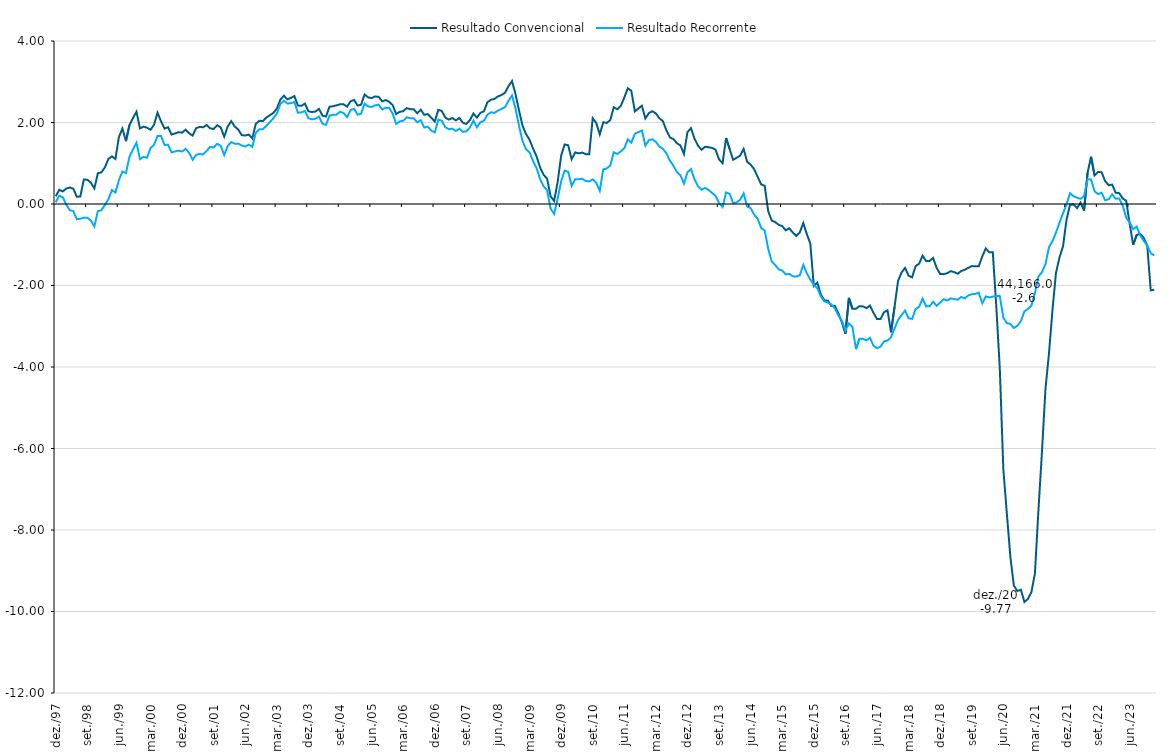
| Category | Resultado Convencional | Resultado Recorrente |
|---|---|---|
| 1997-12-01 | 0.189 | 0.044 |
| 1998-01-01 | 0.349 | 0.204 |
| 1998-02-01 | 0.309 | 0.165 |
| 1998-03-01 | 0.38 | -0.016 |
| 1998-04-01 | 0.404 | -0.152 |
| 1998-05-01 | 0.376 | -0.176 |
| 1998-06-01 | 0.177 | -0.372 |
| 1998-07-01 | 0.184 | -0.362 |
| 1998-08-01 | 0.601 | -0.334 |
| 1998-09-01 | 0.595 | -0.337 |
| 1998-10-01 | 0.525 | -0.407 |
| 1998-11-01 | 0.382 | -0.55 |
| 1998-12-01 | 0.756 | -0.174 |
| 1999-01-01 | 0.776 | -0.153 |
| 1999-02-01 | 0.9 | -0.024 |
| 1999-03-01 | 1.105 | 0.116 |
| 1999-04-01 | 1.168 | 0.341 |
| 1999-05-01 | 1.106 | 0.282 |
| 1999-06-01 | 1.646 | 0.589 |
| 1999-07-01 | 1.85 | 0.797 |
| 1999-08-01 | 1.542 | 0.759 |
| 1999-09-01 | 1.939 | 1.16 |
| 1999-10-01 | 2.109 | 1.337 |
| 1999-11-01 | 2.265 | 1.502 |
| 1999-12-01 | 1.854 | 1.102 |
| 2000-01-01 | 1.9 | 1.156 |
| 2000-02-01 | 1.873 | 1.136 |
| 2000-03-01 | 1.822 | 1.372 |
| 2000-04-01 | 1.944 | 1.453 |
| 2000-05-01 | 2.241 | 1.667 |
| 2000-06-01 | 2.029 | 1.668 |
| 2000-07-01 | 1.85 | 1.45 |
| 2000-08-01 | 1.884 | 1.452 |
| 2000-09-01 | 1.704 | 1.267 |
| 2000-10-01 | 1.732 | 1.289 |
| 2000-11-01 | 1.763 | 1.312 |
| 2000-12-01 | 1.75 | 1.288 |
| 2001-01-01 | 1.824 | 1.352 |
| 2001-02-01 | 1.735 | 1.255 |
| 2001-03-01 | 1.678 | 1.086 |
| 2001-04-01 | 1.862 | 1.206 |
| 2001-05-01 | 1.892 | 1.227 |
| 2001-06-01 | 1.883 | 1.216 |
| 2001-07-01 | 1.937 | 1.303 |
| 2001-08-01 | 1.856 | 1.401 |
| 2001-09-01 | 1.842 | 1.386 |
| 2001-10-01 | 1.933 | 1.478 |
| 2001-11-01 | 1.879 | 1.426 |
| 2001-12-01 | 1.652 | 1.203 |
| 2002-01-01 | 1.902 | 1.422 |
| 2002-02-01 | 2.034 | 1.519 |
| 2002-03-01 | 1.902 | 1.479 |
| 2002-04-01 | 1.826 | 1.482 |
| 2002-05-01 | 1.688 | 1.434 |
| 2002-06-01 | 1.681 | 1.411 |
| 2002-07-01 | 1.704 | 1.457 |
| 2002-08-01 | 1.611 | 1.401 |
| 2002-09-01 | 1.968 | 1.749 |
| 2002-10-01 | 2.043 | 1.831 |
| 2002-11-01 | 2.034 | 1.836 |
| 2002-12-01 | 2.121 | 1.918 |
| 2003-01-01 | 2.178 | 2.01 |
| 2003-02-01 | 2.236 | 2.104 |
| 2003-03-01 | 2.342 | 2.221 |
| 2003-04-01 | 2.563 | 2.455 |
| 2003-05-01 | 2.656 | 2.536 |
| 2003-06-01 | 2.569 | 2.465 |
| 2003-07-01 | 2.604 | 2.473 |
| 2003-08-01 | 2.649 | 2.505 |
| 2003-09-01 | 2.416 | 2.239 |
| 2003-10-01 | 2.411 | 2.249 |
| 2003-11-01 | 2.463 | 2.281 |
| 2003-12-01 | 2.275 | 2.104 |
| 2004-01-01 | 2.257 | 2.078 |
| 2004-02-01 | 2.269 | 2.092 |
| 2004-03-01 | 2.335 | 2.146 |
| 2004-04-01 | 2.168 | 1.971 |
| 2004-05-01 | 2.147 | 1.94 |
| 2004-06-01 | 2.386 | 2.169 |
| 2004-07-01 | 2.399 | 2.187 |
| 2004-08-01 | 2.421 | 2.194 |
| 2004-09-01 | 2.447 | 2.264 |
| 2004-10-01 | 2.448 | 2.235 |
| 2004-11-01 | 2.387 | 2.13 |
| 2004-12-01 | 2.52 | 2.304 |
| 2005-01-01 | 2.553 | 2.337 |
| 2005-02-01 | 2.416 | 2.192 |
| 2005-03-01 | 2.436 | 2.213 |
| 2005-04-01 | 2.689 | 2.464 |
| 2005-05-01 | 2.617 | 2.394 |
| 2005-06-01 | 2.6 | 2.382 |
| 2005-07-01 | 2.638 | 2.421 |
| 2005-08-01 | 2.63 | 2.437 |
| 2005-09-01 | 2.52 | 2.322 |
| 2005-10-01 | 2.55 | 2.36 |
| 2005-11-01 | 2.506 | 2.359 |
| 2005-12-01 | 2.427 | 2.217 |
| 2006-01-01 | 2.207 | 1.965 |
| 2006-02-01 | 2.262 | 2.027 |
| 2006-03-01 | 2.277 | 2.044 |
| 2006-04-01 | 2.354 | 2.127 |
| 2006-05-01 | 2.327 | 2.104 |
| 2006-06-01 | 2.324 | 2.103 |
| 2006-07-01 | 2.227 | 2.005 |
| 2006-08-01 | 2.313 | 2.057 |
| 2006-09-01 | 2.189 | 1.877 |
| 2006-10-01 | 2.207 | 1.898 |
| 2006-11-01 | 2.117 | 1.799 |
| 2006-12-01 | 2.023 | 1.756 |
| 2007-01-01 | 2.311 | 2.072 |
| 2007-02-01 | 2.283 | 2.042 |
| 2007-03-01 | 2.12 | 1.882 |
| 2007-04-01 | 2.071 | 1.837 |
| 2007-05-01 | 2.11 | 1.849 |
| 2007-06-01 | 2.052 | 1.793 |
| 2007-07-01 | 2.113 | 1.849 |
| 2007-08-01 | 1.993 | 1.77 |
| 2007-09-01 | 1.964 | 1.784 |
| 2007-10-01 | 2.058 | 1.875 |
| 2007-11-01 | 2.22 | 2.044 |
| 2007-12-01 | 2.119 | 1.883 |
| 2008-01-01 | 2.238 | 2.008 |
| 2008-02-01 | 2.275 | 2.043 |
| 2008-03-01 | 2.496 | 2.192 |
| 2008-04-01 | 2.559 | 2.25 |
| 2008-05-01 | 2.579 | 2.234 |
| 2008-06-01 | 2.641 | 2.293 |
| 2008-07-01 | 2.674 | 2.331 |
| 2008-08-01 | 2.73 | 2.378 |
| 2008-09-01 | 2.891 | 2.531 |
| 2008-10-01 | 3.017 | 2.662 |
| 2008-11-01 | 2.7 | 2.351 |
| 2008-12-01 | 2.297 | 1.916 |
| 2009-01-01 | 1.924 | 1.547 |
| 2009-02-01 | 1.715 | 1.342 |
| 2009-03-01 | 1.577 | 1.268 |
| 2009-04-01 | 1.361 | 1.052 |
| 2009-05-01 | 1.169 | 0.881 |
| 2009-06-01 | 0.897 | 0.614 |
| 2009-07-01 | 0.716 | 0.434 |
| 2009-08-01 | 0.623 | 0.342 |
| 2009-09-01 | 0.188 | -0.112 |
| 2009-10-01 | 0.075 | -0.244 |
| 2009-11-01 | 0.533 | 0.125 |
| 2009-12-01 | 1.183 | 0.555 |
| 2010-01-01 | 1.461 | 0.817 |
| 2010-02-01 | 1.441 | 0.791 |
| 2010-03-01 | 1.097 | 0.444 |
| 2010-04-01 | 1.266 | 0.607 |
| 2010-05-01 | 1.243 | 0.609 |
| 2010-06-01 | 1.262 | 0.619 |
| 2010-07-01 | 1.224 | 0.565 |
| 2010-08-01 | 1.22 | 0.553 |
| 2010-09-01 | 2.105 | 0.604 |
| 2010-10-01 | 1.989 | 0.525 |
| 2010-11-01 | 1.709 | 0.322 |
| 2010-12-01 | 2.004 | 0.85 |
| 2011-01-01 | 1.989 | 0.871 |
| 2011-02-01 | 2.058 | 0.948 |
| 2011-03-01 | 2.373 | 1.268 |
| 2011-04-01 | 2.324 | 1.228 |
| 2011-05-01 | 2.407 | 1.292 |
| 2011-06-01 | 2.615 | 1.37 |
| 2011-07-01 | 2.838 | 1.585 |
| 2011-08-01 | 2.779 | 1.506 |
| 2011-09-01 | 2.274 | 1.721 |
| 2011-10-01 | 2.342 | 1.765 |
| 2011-11-01 | 2.41 | 1.804 |
| 2011-12-01 | 2.1 | 1.433 |
| 2012-01-01 | 2.231 | 1.566 |
| 2012-02-01 | 2.277 | 1.588 |
| 2012-03-01 | 2.223 | 1.523 |
| 2012-04-01 | 2.105 | 1.408 |
| 2012-05-01 | 2.033 | 1.353 |
| 2012-06-01 | 1.807 | 1.242 |
| 2012-07-01 | 1.632 | 1.066 |
| 2012-08-01 | 1.592 | 0.937 |
| 2012-09-01 | 1.491 | 0.783 |
| 2012-10-01 | 1.435 | 0.704 |
| 2012-11-01 | 1.227 | 0.501 |
| 2012-12-01 | 1.765 | 0.777 |
| 2013-01-01 | 1.862 | 0.857 |
| 2013-02-01 | 1.604 | 0.609 |
| 2013-03-01 | 1.433 | 0.438 |
| 2013-04-01 | 1.332 | 0.35 |
| 2013-05-01 | 1.403 | 0.394 |
| 2013-06-01 | 1.395 | 0.344 |
| 2013-07-01 | 1.376 | 0.271 |
| 2013-08-01 | 1.333 | 0.203 |
| 2013-09-01 | 1.095 | 0.024 |
| 2013-10-01 | 1 | -0.076 |
| 2013-11-01 | 1.62 | 0.284 |
| 2013-12-01 | 1.353 | 0.25 |
| 2014-01-01 | 1.084 | 0.023 |
| 2014-02-01 | 1.135 | 0.04 |
| 2014-03-01 | 1.187 | 0.103 |
| 2014-04-01 | 1.351 | 0.26 |
| 2014-05-01 | 1.035 | -0.063 |
| 2014-06-01 | 0.967 | -0.103 |
| 2014-07-01 | 0.853 | -0.261 |
| 2014-08-01 | 0.666 | -0.359 |
| 2014-09-01 | 0.482 | -0.591 |
| 2014-10-01 | 0.446 | -0.65 |
| 2014-11-01 | -0.175 | -1.1 |
| 2014-12-01 | -0.406 | -1.412 |
| 2015-01-01 | -0.444 | -1.498 |
| 2015-02-01 | -0.514 | -1.603 |
| 2015-03-01 | -0.541 | -1.631 |
| 2015-04-01 | -0.646 | -1.727 |
| 2015-05-01 | -0.595 | -1.714 |
| 2015-06-01 | -0.698 | -1.774 |
| 2015-07-01 | -0.782 | -1.782 |
| 2015-08-01 | -0.697 | -1.75 |
| 2015-09-01 | -0.467 | -1.494 |
| 2015-10-01 | -0.737 | -1.7 |
| 2015-11-01 | -0.971 | -1.853 |
| 2015-12-01 | -2.01 | -1.982 |
| 2016-01-01 | -1.929 | -2.069 |
| 2016-02-01 | -2.22 | -2.268 |
| 2016-03-01 | -2.363 | -2.392 |
| 2016-04-01 | -2.372 | -2.42 |
| 2016-05-01 | -2.501 | -2.465 |
| 2016-06-01 | -2.502 | -2.562 |
| 2016-07-01 | -2.682 | -2.735 |
| 2016-08-01 | -2.906 | -2.868 |
| 2016-09-01 | -3.187 | -3.106 |
| 2016-10-01 | -2.306 | -2.931 |
| 2016-11-01 | -2.57 | -3.015 |
| 2016-12-01 | -2.572 | -3.56 |
| 2017-01-01 | -2.507 | -3.307 |
| 2017-02-01 | -2.513 | -3.31 |
| 2017-03-01 | -2.554 | -3.346 |
| 2017-04-01 | -2.492 | -3.285 |
| 2017-05-01 | -2.672 | -3.477 |
| 2017-06-01 | -2.821 | -3.539 |
| 2017-07-01 | -2.824 | -3.501 |
| 2017-08-01 | -2.656 | -3.37 |
| 2017-09-01 | -2.61 | -3.352 |
| 2017-10-01 | -3.147 | -3.271 |
| 2017-11-01 | -2.528 | -3.055 |
| 2017-12-01 | -1.887 | -2.845 |
| 2018-01-01 | -1.682 | -2.726 |
| 2018-02-01 | -1.568 | -2.616 |
| 2018-03-01 | -1.76 | -2.805 |
| 2018-04-01 | -1.8 | -2.819 |
| 2018-05-01 | -1.525 | -2.58 |
| 2018-06-01 | -1.465 | -2.522 |
| 2018-07-01 | -1.27 | -2.322 |
| 2018-08-01 | -1.401 | -2.512 |
| 2018-09-01 | -1.397 | -2.508 |
| 2018-10-01 | -1.324 | -2.398 |
| 2018-11-01 | -1.568 | -2.498 |
| 2018-12-01 | -1.716 | -2.419 |
| 2019-01-01 | -1.722 | -2.337 |
| 2019-02-01 | -1.699 | -2.368 |
| 2019-03-01 | -1.648 | -2.316 |
| 2019-04-01 | -1.672 | -2.333 |
| 2019-05-01 | -1.711 | -2.351 |
| 2019-06-01 | -1.644 | -2.281 |
| 2019-07-01 | -1.614 | -2.317 |
| 2019-08-01 | -1.568 | -2.245 |
| 2019-09-01 | -1.524 | -2.213 |
| 2019-10-01 | -1.527 | -2.206 |
| 2019-11-01 | -1.526 | -2.177 |
| 2019-12-01 | -1.287 | -2.437 |
| 2020-01-01 | -1.09 | -2.269 |
| 2020-02-01 | -1.187 | -2.292 |
| 2020-03-01 | -1.182 | -2.272 |
| 2020-04-01 | -2.524 | -2.259 |
| 2020-05-01 | -4.046 | -2.261 |
| 2020-06-01 | -6.506 | -2.787 |
| 2020-07-01 | -7.597 | -2.923 |
| 2020-08-01 | -8.654 | -2.943 |
| 2020-09-01 | -9.365 | -3.042 |
| 2020-10-01 | -9.497 | -2.989 |
| 2020-11-01 | -9.466 | -2.874 |
| 2020-12-01 | -9.767 | -2.635 |
| 2021-01-01 | -9.693 | -2.575 |
| 2021-02-01 | -9.524 | -2.49 |
| 2021-03-01 | -9.068 | -2.187 |
| 2021-04-01 | -7.517 | -1.78 |
| 2021-05-01 | -6.091 | -1.673 |
| 2021-06-01 | -4.545 | -1.478 |
| 2021-07-01 | -3.672 | -1.058 |
| 2021-08-01 | -2.605 | -0.913 |
| 2021-09-01 | -1.691 | -0.701 |
| 2021-10-01 | -1.31 | -0.459 |
| 2021-11-01 | -1.043 | -0.226 |
| 2021-12-01 | -0.389 | -0.009 |
| 2022-01-01 | -0.019 | 0.264 |
| 2022-02-01 | -0.009 | 0.192 |
| 2022-03-01 | -0.101 | 0.153 |
| 2022-04-01 | 0.033 | 0.126 |
| 2022-05-01 | -0.163 | 0.197 |
| 2022-06-01 | 0.767 | 0.607 |
| 2022-07-01 | 1.16 | 0.601 |
| 2022-08-01 | 0.701 | 0.311 |
| 2022-09-01 | 0.785 | 0.241 |
| 2022-10-01 | 0.78 | 0.279 |
| 2022-11-01 | 0.563 | 0.092 |
| 2022-12-01 | 0.46 | 0.117 |
| 2023-01-01 | 0.477 | 0.236 |
| 2023-02-01 | 0.276 | 0.131 |
| 2023-03-01 | 0.267 | 0.137 |
| 2023-04-01 | 0.137 | -0.036 |
| 2023-05-01 | 0.081 | -0.333 |
| 2023-06-01 | -0.486 | -0.454 |
| 2023-07-01 | -1.003 | -0.618 |
| 2023-08-01 | -0.757 | -0.556 |
| 2023-09-01 | -0.734 | -0.772 |
| 2023-10-01 | -0.83 | -0.903 |
| 2023-11-01 | -1.022 | -1.023 |
| 2023-12-01 | -2.121 | -1.204 |
| 2024-01-01 | -2.103 | -1.266 |